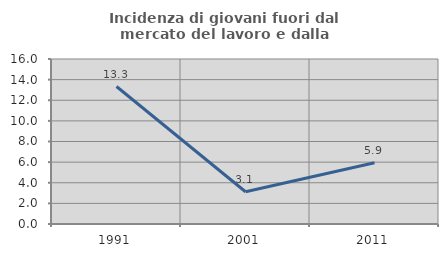
| Category | Incidenza di giovani fuori dal mercato del lavoro e dalla formazione  |
|---|---|
| 1991.0 | 13.333 |
| 2001.0 | 3.125 |
| 2011.0 | 5.932 |